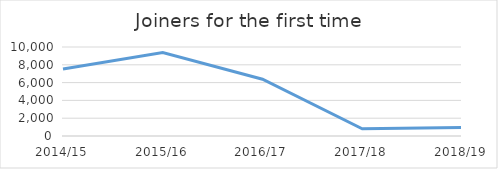
| Category | Joiners for the first time |
|---|---|
| 2014/15 | 7518 |
| 2015/16 | 9389 |
| 2016/17 | 6382 |
| 2017/18 | 805 |
| 2018/19 | 968 |